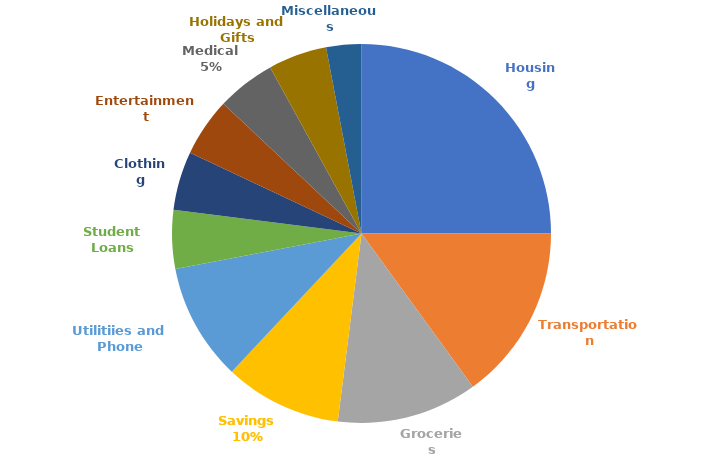
| Category | AMOUNT |
|---|---|
| Housing | 625 |
| Transportation | 375 |
| Groceries | 300 |
| Savings | 250 |
| Utilitiies and Phone | 250 |
| Student Loans | 125 |
| Clothing | 125 |
| Entertainment | 125 |
| Medical | 125 |
| Holidays and Gifts | 125 |
| Miscellaneous | 75 |